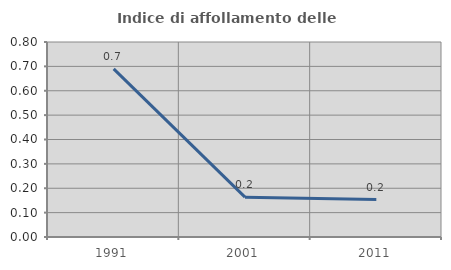
| Category | Indice di affollamento delle abitazioni  |
|---|---|
| 1991.0 | 0.69 |
| 2001.0 | 0.163 |
| 2011.0 | 0.153 |